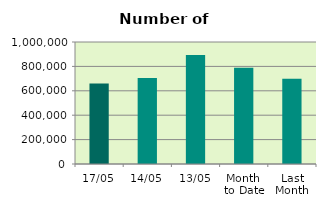
| Category | Series 0 |
|---|---|
| 17/05 | 660252 |
| 14/05 | 704982 |
| 13/05 | 892678 |
| Month 
to Date | 788354.545 |
| Last
Month | 699227 |